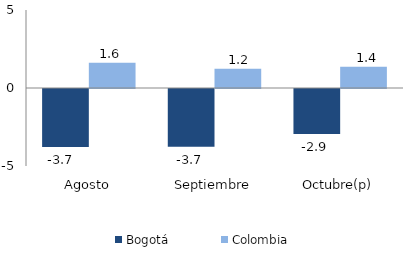
| Category | Bogotá | Colombia |
|---|---|---|
| Agosto | -3.723 | 1.62 |
| Septiembre | -3.695 | 1.232 |
| Octubre(p) | -2.884 | 1.357 |